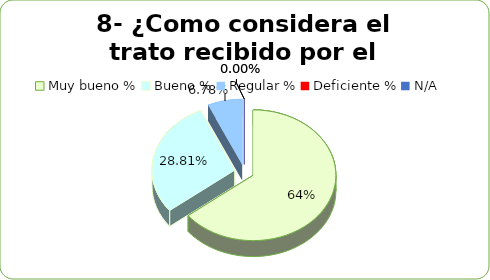
| Category | Series 0 |
|---|---|
| Muy bueno % | 0.644 |
| Bueno % | 0.288 |
| Regular % | 0.068 |
| Deficiente % | 0 |
| N/A | 0 |